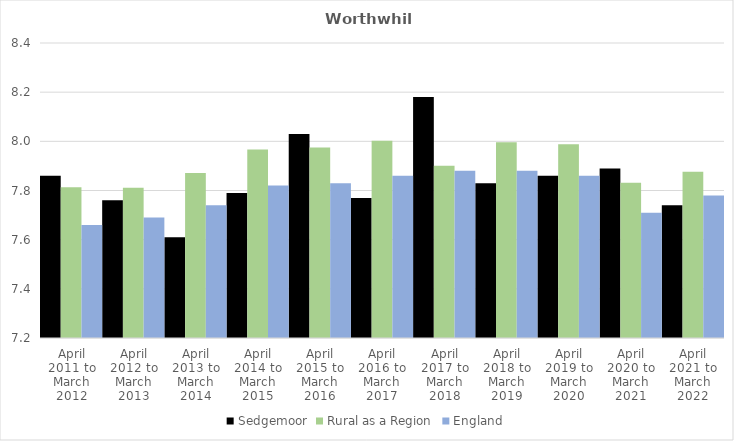
| Category | Sedgemoor | Rural as a Region | England |
|---|---|---|---|
| April 2011 to March 2012 | 7.86 | 7.813 | 7.66 |
| April 2012 to March 2013 | 7.76 | 7.811 | 7.69 |
| April 2013 to March 2014 | 7.61 | 7.871 | 7.74 |
| April 2014 to March 2015 | 7.79 | 7.967 | 7.82 |
| April 2015 to March 2016 | 8.03 | 7.975 | 7.83 |
| April 2016 to March 2017 | 7.77 | 8.002 | 7.86 |
| April 2017 to March 2018 | 8.18 | 7.9 | 7.88 |
| April 2018 to March 2019 | 7.83 | 7.996 | 7.88 |
| April 2019 to March 2020 | 7.86 | 7.988 | 7.86 |
| April 2020 to March 2021 | 7.89 | 7.831 | 7.71 |
| April 2021 to March 2022 | 7.74 | 7.877 | 7.78 |